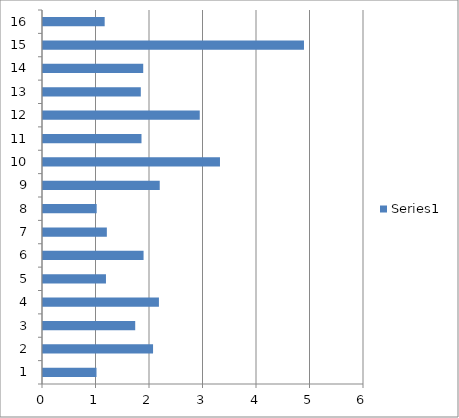
| Category | Series 0 |
|---|---|
| 0 | 1 |
| 1 | 2.057 |
| 2 | 1.724 |
| 3 | 2.167 |
| 4 | 1.177 |
| 5 | 1.88 |
| 6 | 1.193 |
| 7 | 1.003 |
| 8 | 2.182 |
| 9 | 3.308 |
| 10 | 1.841 |
| 11 | 2.93 |
| 12 | 1.828 |
| 13 | 1.873 |
| 14 | 4.878 |
| 15 | 1.153 |